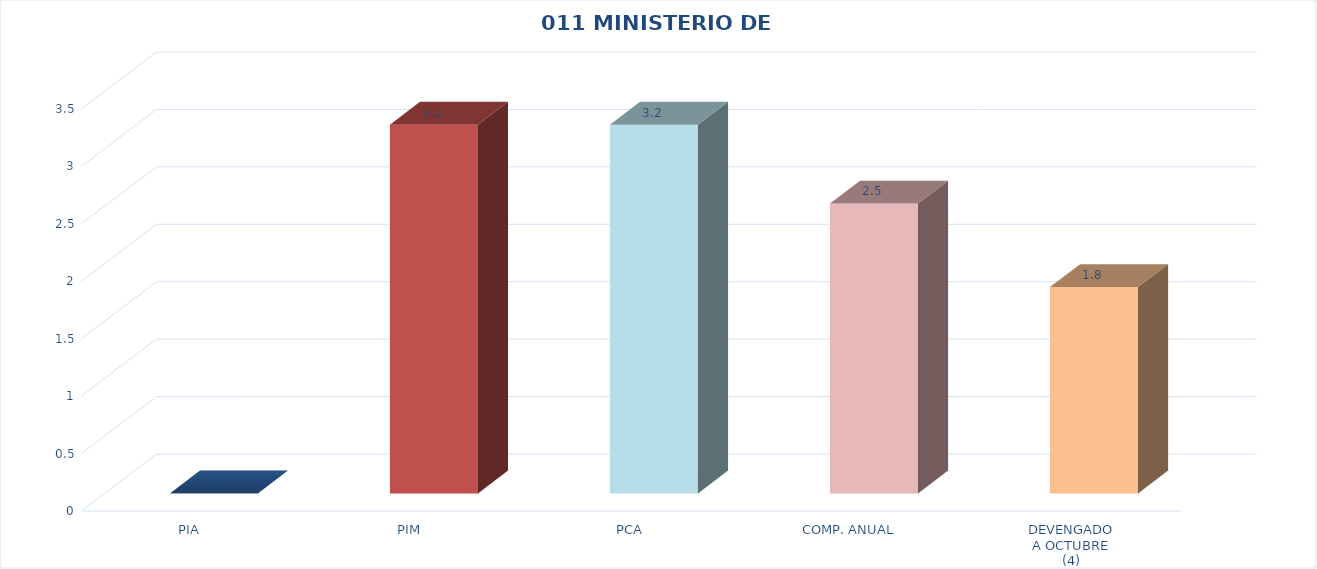
| Category | 011 MINISTERIO DE SALUD |
|---|---|
| PIA | 0 |
| PIM | 3.21 |
| PCA | 3.21 |
| COMP. ANUAL | 2.524 |
| DEVENGADO
A OCTUBRE
(4) | 1.796 |